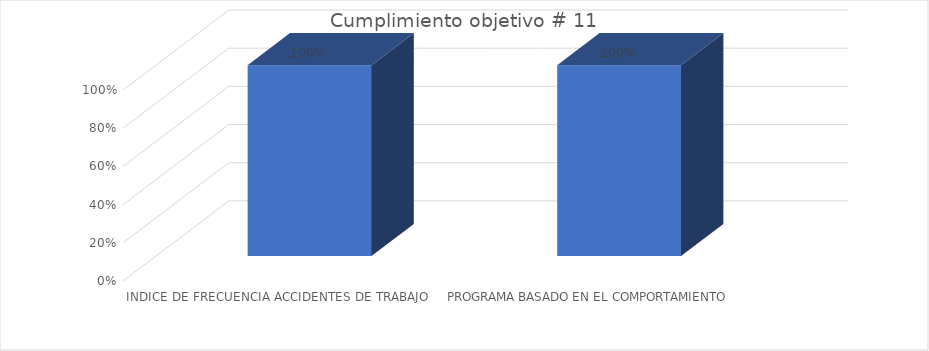
| Category | Series 0 |
|---|---|
| INDICE DE FRECUENCIA ACCIDENTES DE TRABAJO | 1 |
| PROGRAMA BASADO EN EL COMPORTAMIENTO HUMANO | 1 |